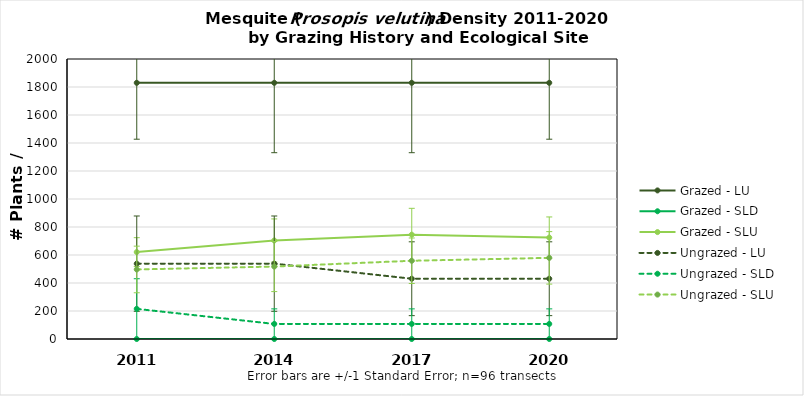
| Category | Grazed - LU | Grazed - SLD | Grazed - SLU | Ungrazed - LU | Ungrazed - SLD | Ungrazed - SLU |
|---|---|---|---|---|---|---|
| 2011.0 | 1829.863 | 0 | 620.994 | 538.195 | 215.278 | 496.795 |
| 2014.0 | 1829.863 | 0 | 703.793 | 538.195 | 107.639 | 517.495 |
| 2017.0 | 1829.863 | 0 | 745.193 | 430.556 | 107.639 | 558.895 |
| 2020.0 | 1829.863 | 0 | 724.493 | 430.556 | 107.639 | 579.595 |